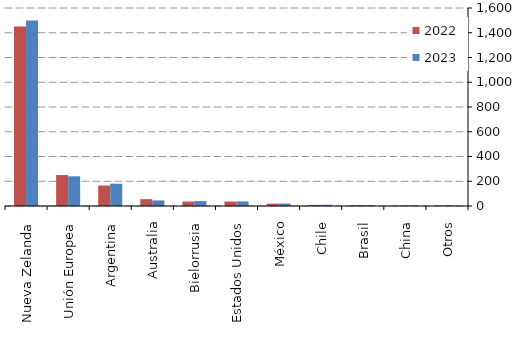
| Category | 2022 | 2023 |
|---|---|---|
| Nueva Zelanda | 1450 | 1500 |
| Unión Europea | 250 | 240 |
| Argentina | 165 | 180 |
| Australia | 55 | 45 |
| Bielorrusia | 36 | 40 |
| Estados Unidos | 36 | 37 |
| México | 19 | 20 |
| Chile | 9 | 10 |
| Brasil | 6 | 6 |
| China | 3 | 5 |
| Otros | 4 | 4 |